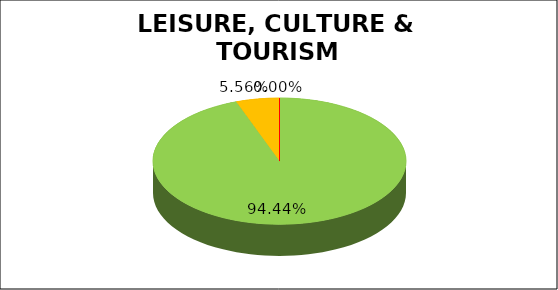
| Category | Q4 |
|---|---|
| Green | 0.944 |
| Amber | 0.056 |
| Red | 0 |